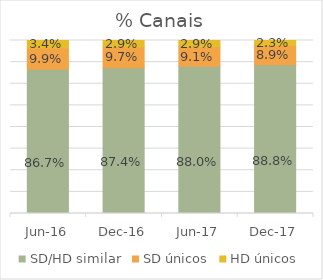
| Category | SD/HD similar | SD únicos | HD únicos |
|---|---|---|---|
| 2016-06-01 | 0.867 | 0.099 | 0.034 |
| 2016-12-01 | 0.874 | 0.097 | 0.029 |
| 2017-06-01 | 0.88 | 0.091 | 0.029 |
| 2017-12-01 | 0.888 | 0.089 | 0.023 |